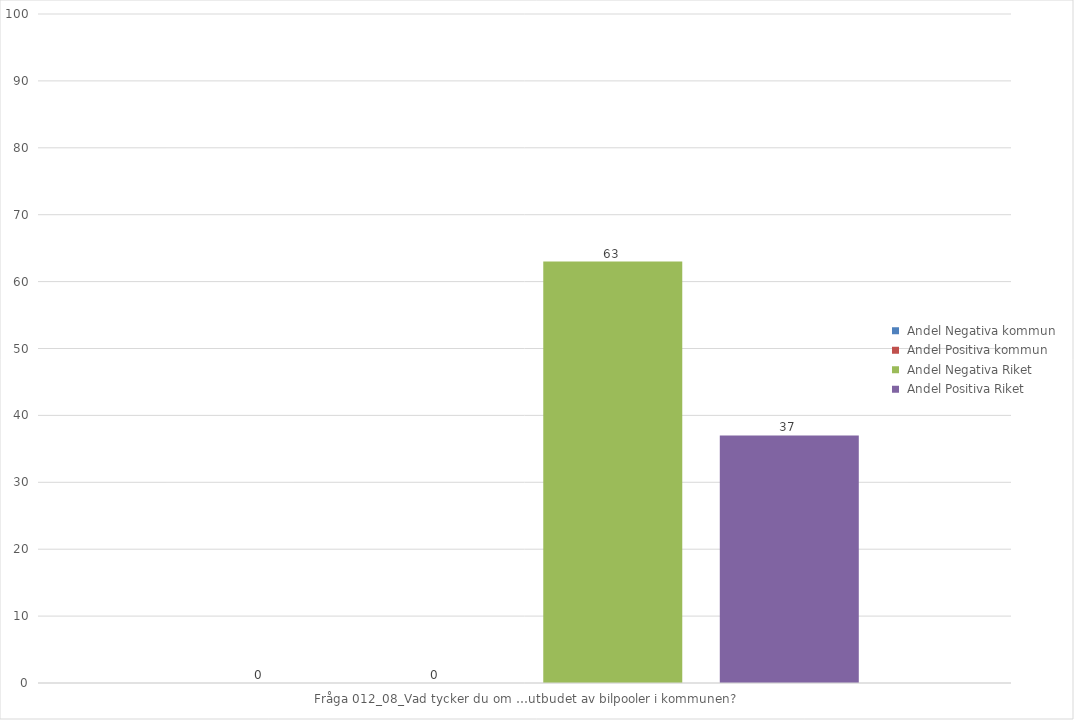
| Category |  Andel Negativa kommun |  Andel Positiva kommun |  Andel Negativa Riket |  Andel Positiva Riket |
|---|---|---|---|---|
| Fråga 012_08_Vad tycker du om …utbudet av bilpooler i kommunen? | 0 | 0 | 63 | 37 |